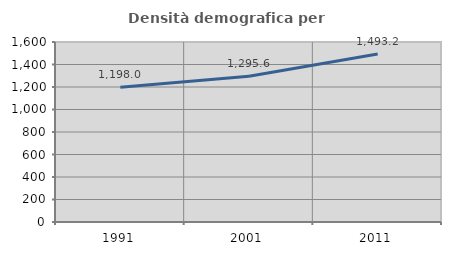
| Category | Densità demografica |
|---|---|
| 1991.0 | 1198.027 |
| 2001.0 | 1295.59 |
| 2011.0 | 1493.151 |